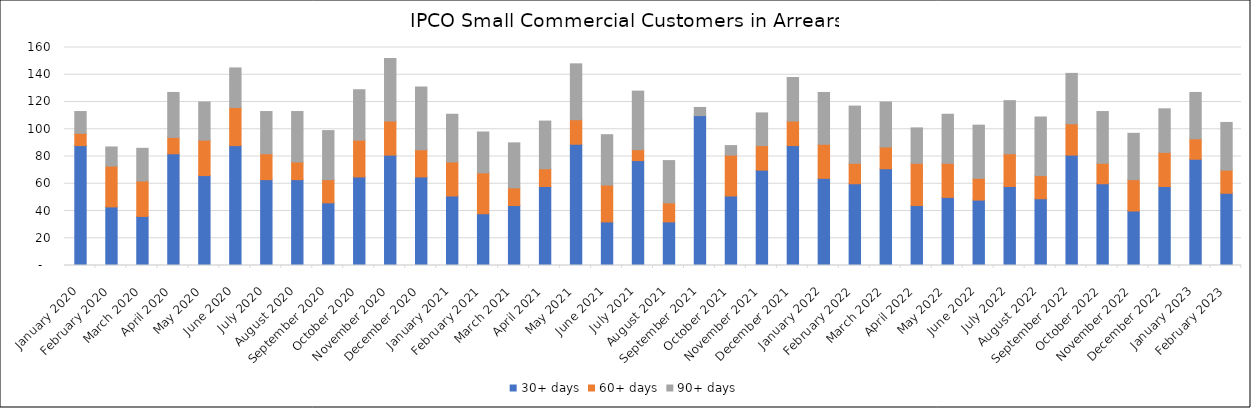
| Category | 30+ days | 60+ days | 90+ days |
|---|---|---|---|
| 2020-01-01 | 88 | 9 | 16 |
| 2020-02-01 | 43 | 30 | 14 |
| 2020-03-01 | 36 | 26 | 24 |
| 2020-04-01 | 82 | 12 | 33 |
| 2020-05-01 | 66 | 26 | 28 |
| 2020-06-01 | 88 | 28 | 29 |
| 2020-07-01 | 63 | 19 | 31 |
| 2020-08-01 | 63 | 13 | 37 |
| 2020-09-01 | 46 | 17 | 36 |
| 2020-10-01 | 65 | 27 | 37 |
| 2020-11-01 | 81 | 25 | 46 |
| 2020-12-01 | 65 | 20 | 46 |
| 2021-01-01 | 51 | 25 | 35 |
| 2021-02-01 | 38 | 30 | 30 |
| 2021-03-01 | 44 | 13 | 33 |
| 2021-04-01 | 58 | 13 | 35 |
| 2021-05-01 | 89 | 18 | 41 |
| 2021-06-01 | 32 | 27 | 37 |
| 2021-07-01 | 77 | 8 | 43 |
| 2021-08-01 | 32 | 14 | 31 |
| 2021-09-01 | 110 | 0 | 6 |
| 2021-10-01 | 51 | 30 | 7 |
| 2021-11-01 | 70 | 18 | 24 |
| 2021-12-01 | 88 | 18 | 32 |
| 2022-01-01 | 64 | 25 | 38 |
| 2022-02-01 | 60 | 15 | 42 |
| 2022-03-01 | 71 | 16 | 33 |
| 2022-04-01 | 44 | 31 | 26 |
| 2022-05-01 | 50 | 25 | 36 |
| 2022-06-01 | 48 | 16 | 39 |
| 2022-07-01 | 58 | 24 | 39 |
| 2022-08-01 | 49 | 17 | 43 |
| 2022-09-01 | 81 | 23 | 37 |
| 2022-10-01 | 60 | 15 | 38 |
| 2022-11-01 | 40 | 23 | 34 |
| 2022-12-01 | 58 | 25 | 32 |
| 2023-01-01 | 78 | 15 | 34 |
| 2023-02-01 | 53 | 17 | 35 |